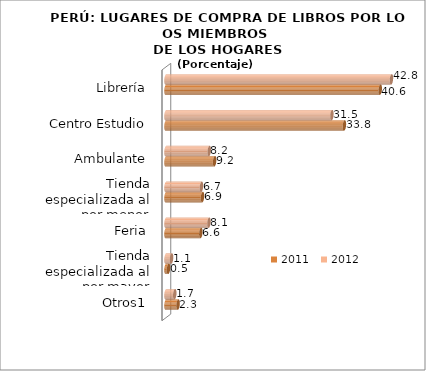
| Category | 2011 | 2012 |
|---|---|---|
| Otros1 | 2.292 | 1.658 |
| Tienda especializada al por mayor | 0.475 | 1.054 |
| Feria | 6.611 | 8.143 |
| Tienda especializada al por menor | 6.925 | 6.726 |
| Ambulante | 9.225 | 8.201 |
| Centro Estudio | 33.837 | 31.464 |
| Librería | 40.635 | 42.754 |